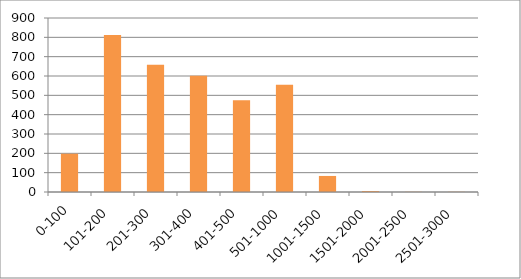
| Category | Series 0 |
|---|---|
| 0-100 | 198 |
| 101-200 | 812 |
| 201-300 | 658 |
| 301-400 | 601 |
| 401-500 | 474 |
| 501-1000 | 555 |
| 1001-1500 | 83 |
| 1501-2000 | 5 |
| 2001-2500 | 1 |
| 2501-3000 | 1 |